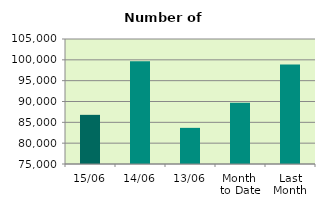
| Category | Series 0 |
|---|---|
| 15/06 | 86796 |
| 14/06 | 99634 |
| 13/06 | 83674 |
| Month 
to Date | 89698.909 |
| Last
Month | 98885.545 |